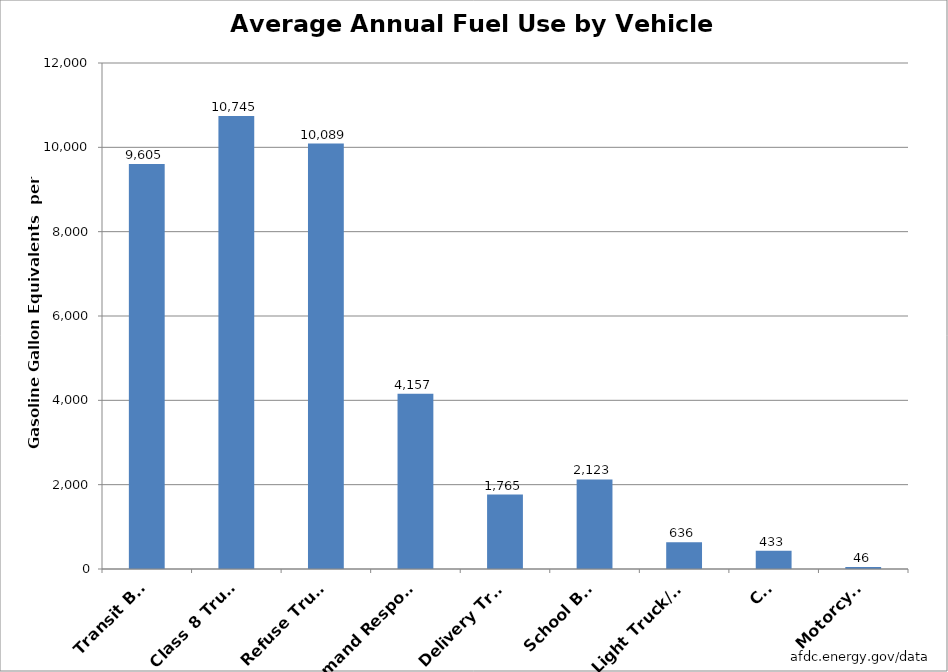
| Category | Series 0 |
|---|---|
| Transit Bus | 9605.263 |
| Class 8 Truck | 10745.472 |
| Refuse Truck | 10089 |
| Demand Response | 4157 |
| Delivery Truck | 1765.171 |
| School Bus | 2122.568 |
| Light Truck/Van | 635.843 |
| Car | 433.32 |
| Motorcycle | 45.568 |